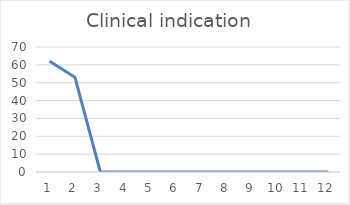
| Category | Clinical indication  |
|---|---|
| 0 | 62 |
| 1 | 53 |
| 2 | 0 |
| 3 | 0 |
| 4 | 0 |
| 5 | 0 |
| 6 | 0 |
| 7 | 0 |
| 8 | 0 |
| 9 | 0 |
| 10 | 0 |
| 11 | 0 |